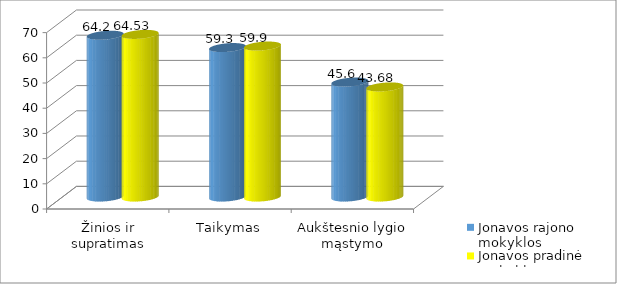
| Category | Jonavos rajono mokyklos | Jonavos pradinė mokykla |
|---|---|---|
| Žinios ir supratimas | 64.2 | 64.53 |
| Taikymas | 59.3 | 59.9 |
| Aukštesnio lygio mąstymo gebėjimai | 45.6 | 43.68 |